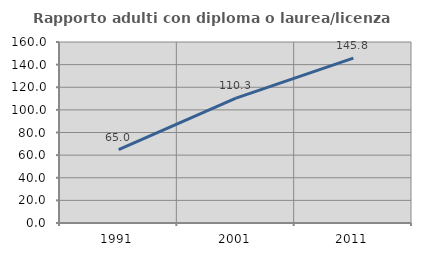
| Category | Rapporto adulti con diploma o laurea/licenza media  |
|---|---|
| 1991.0 | 64.968 |
| 2001.0 | 110.34 |
| 2011.0 | 145.807 |